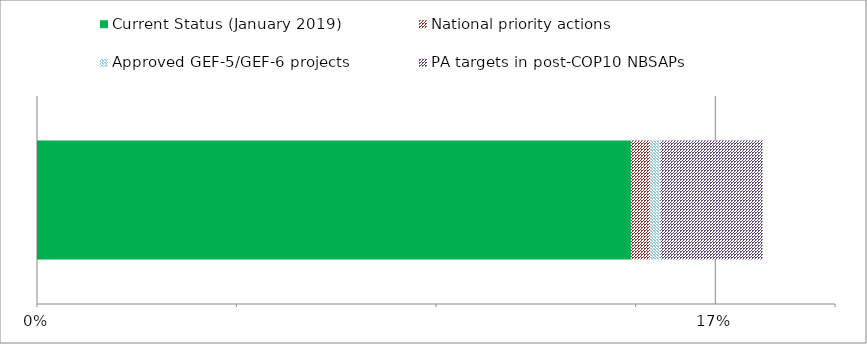
| Category | Current Status (January 2019) | National priority actions | Approved GEF-5/GEF-6 projects  | PA targets in post-COP10 NBSAPs |
|---|---|---|---|---|
| 0 | 0.149 | 0.005 | 0.002 | 0.026 |